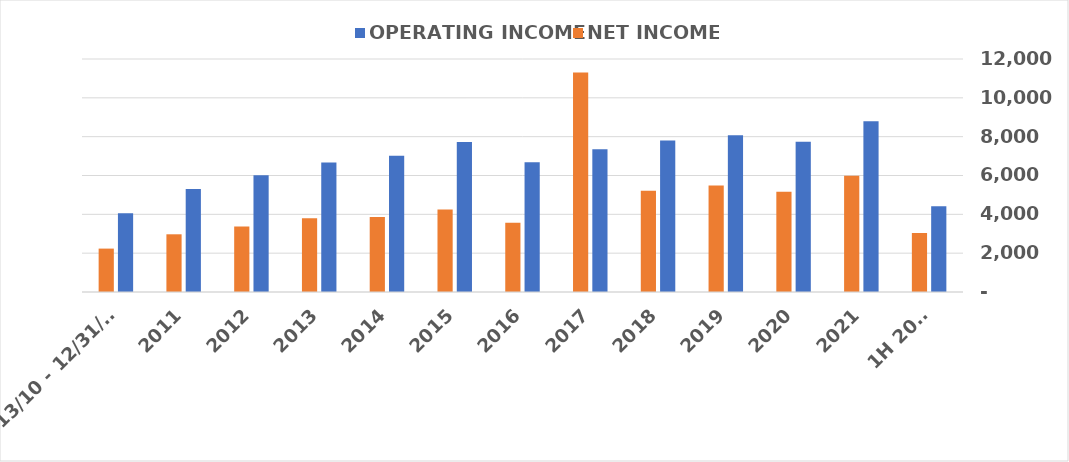
| Category | OPERATING INCOME | NET INCOME |
|---|---|---|
| 1H 2022 | 4420 | 3035 |
| 2021 | 8798 | 5990 |
| 2020 | 7740 | 5161 |
| 2019 | 8071 | 5481 |
| 2018 | 7800 | 5219 |
| 2017 | 7347 | 11300 |
| 2016 | 6685 | 3569 |
| 2015 | 7724 | 4248 |
| 2014 | 7013 | 3869 |
| 2013 | 6667 | 3793 |
| 2012 | 6012 | 3372 |
| 2011 | 5310 | 2972 |
| 2/13/10 - 12/31/10 | 4053 | 2235 |